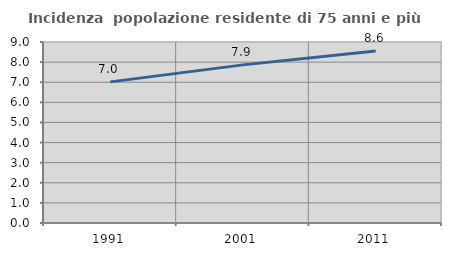
| Category | Incidenza  popolazione residente di 75 anni e più |
|---|---|
| 1991.0 | 7.018 |
| 2001.0 | 7.862 |
| 2011.0 | 8.557 |